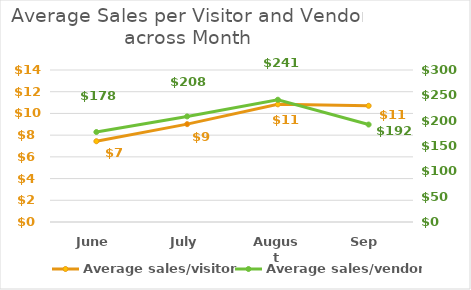
| Category | Average sales/visitor |
|---|---|
| June | 7.439 |
| July | 9.012 |
| August | 10.837 |
| Sep | 10.703 |